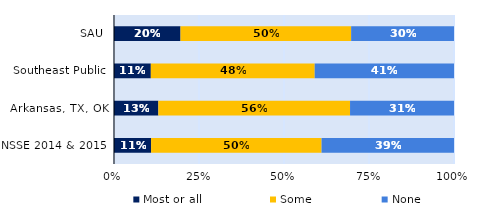
| Category | Most or all | Some | None |
|---|---|---|---|
| SAU | 0.196 | 0.502 | 0.303 |
| Southeast Public | 0.108 | 0.482 | 0.41 |
| Arkansas, TX, OK | 0.13 | 0.564 | 0.306 |
| NSSE 2014 & 2015 | 0.109 | 0.501 | 0.39 |